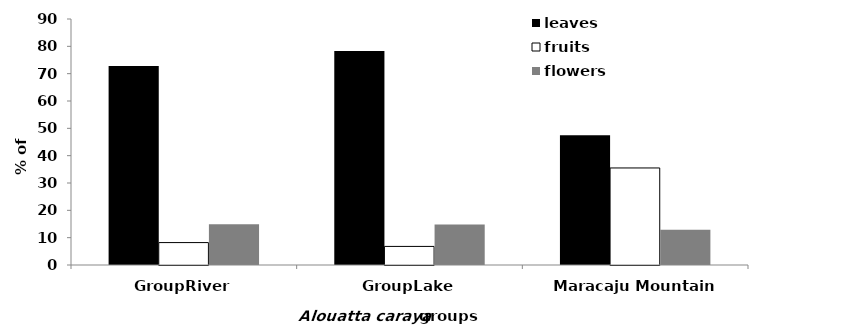
| Category | leaves | fruits | flowers |
|---|---|---|---|
| GroupRiver | 72.8 | 8.2 | 14.9 |
| GroupLake | 78.3 | 6.8 | 14.8 |
| Maracaju Mountain | 47.5 | 35.5 | 12.9 |